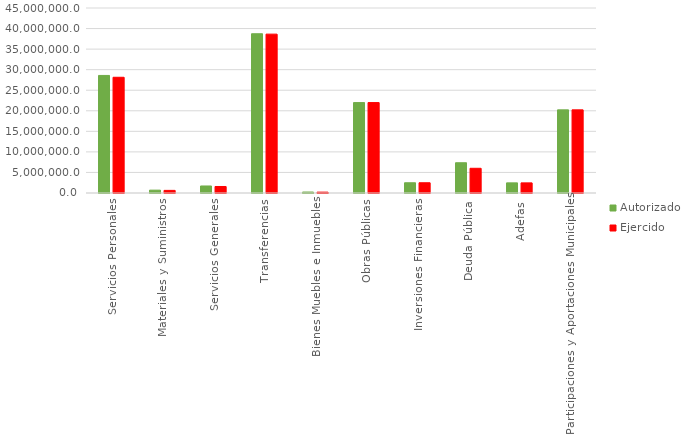
| Category | Autorizado | Ejercido |
|---|---|---|
| Servicios Personales | 28592943 | 28149394.1 |
| Materiales y Suministros | 691760.6 | 637747.9 |
| Servicios Generales | 1708226.7 | 1582144.5 |
| Transferencias | 38740027.7 | 38641484.8 |
| Bienes Muebles e Inmuebles | 233605.6 | 207195.9 |
| Obras Públicas | 21992973.9 | 21992973.9 |
| Inversiones Financieras | 2492774 | 2492774 |
| Deuda Pública | 7360051.4 | 6011221.6 |
| Adefas | 2466112.4 | 2462560 |
| Participaciones y Aportaciones Municipales | 20227879.4 | 20227879.4 |